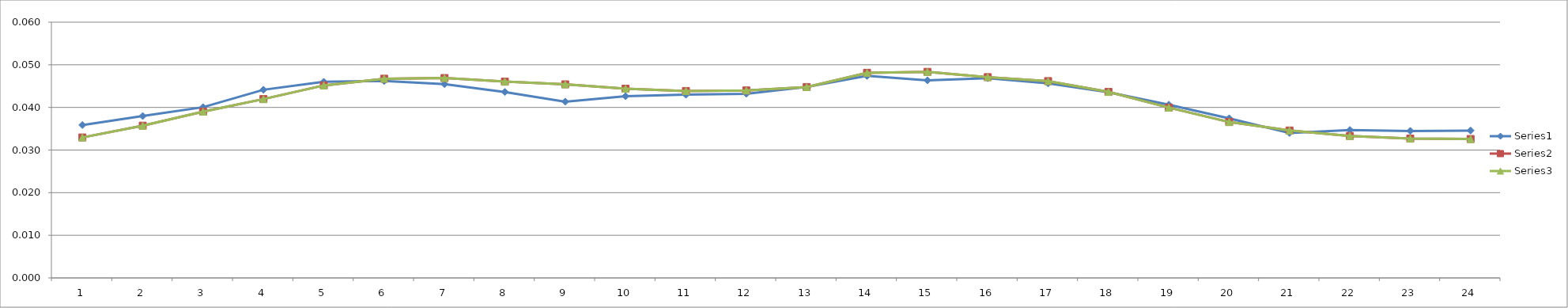
| Category | Series 0 | Series 1 | Series 2 |
|---|---|---|---|
| 0 | 0.036 | 0.033 | 0.033 |
| 1 | 0.038 | 0.036 | 0.036 |
| 2 | 0.04 | 0.039 | 0.039 |
| 3 | 0.044 | 0.042 | 0.042 |
| 4 | 0.046 | 0.045 | 0.045 |
| 5 | 0.046 | 0.047 | 0.047 |
| 6 | 0.045 | 0.047 | 0.047 |
| 7 | 0.044 | 0.046 | 0.046 |
| 8 | 0.041 | 0.045 | 0.045 |
| 9 | 0.043 | 0.044 | 0.044 |
| 10 | 0.043 | 0.044 | 0.044 |
| 11 | 0.043 | 0.044 | 0.044 |
| 12 | 0.045 | 0.045 | 0.045 |
| 13 | 0.047 | 0.048 | 0.048 |
| 14 | 0.046 | 0.048 | 0.048 |
| 15 | 0.047 | 0.047 | 0.047 |
| 16 | 0.046 | 0.046 | 0.046 |
| 17 | 0.044 | 0.044 | 0.044 |
| 18 | 0.041 | 0.04 | 0.04 |
| 19 | 0.037 | 0.037 | 0.037 |
| 20 | 0.034 | 0.035 | 0.035 |
| 21 | 0.035 | 0.033 | 0.033 |
| 22 | 0.034 | 0.033 | 0.033 |
| 23 | 0.035 | 0.033 | 0.033 |